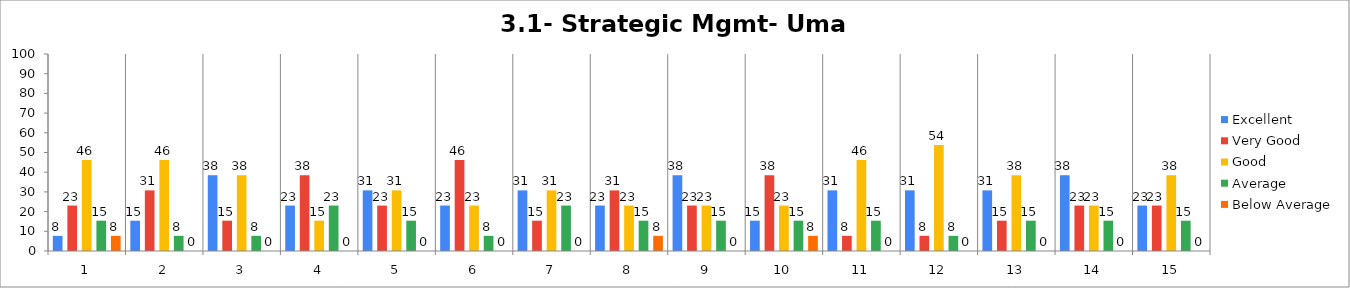
| Category | Excellent | Very Good | Good | Average | Below Average |
|---|---|---|---|---|---|
| 0 | 7.692 | 23.077 | 46.154 | 15.385 | 7.692 |
| 1 | 15.385 | 30.769 | 46.154 | 7.692 | 0 |
| 2 | 38.462 | 15.385 | 38.462 | 7.692 | 0 |
| 3 | 23.077 | 38.462 | 15.385 | 23.077 | 0 |
| 4 | 30.769 | 23.077 | 30.769 | 15.385 | 0 |
| 5 | 23.077 | 46.154 | 23.077 | 7.692 | 0 |
| 6 | 30.769 | 15.385 | 30.769 | 23.077 | 0 |
| 7 | 23.077 | 30.769 | 23.077 | 15.385 | 7.692 |
| 8 | 38.462 | 23.077 | 23.077 | 15.385 | 0 |
| 9 | 15.385 | 38.462 | 23.077 | 15.385 | 7.692 |
| 10 | 30.769 | 7.692 | 46.154 | 15.385 | 0 |
| 11 | 30.769 | 7.692 | 53.846 | 7.692 | 0 |
| 12 | 30.769 | 15.385 | 38.462 | 15.385 | 0 |
| 13 | 38.462 | 23.077 | 23.077 | 15.385 | 0 |
| 14 | 23.077 | 23.077 | 38.462 | 15.385 | 0 |